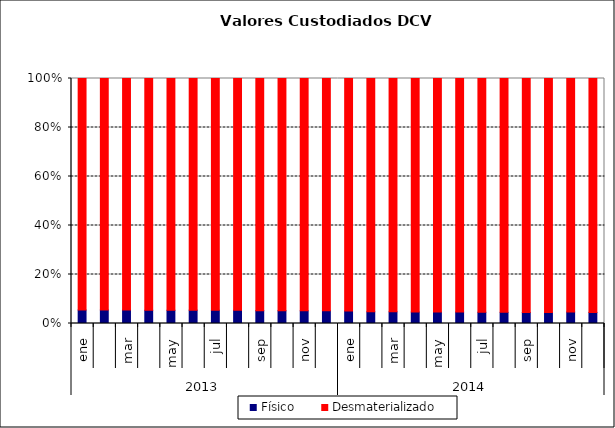
| Category | Físico | Desmaterializado |
|---|---|---|
| 0 | 17921.653 | 307082.68 |
| 1 | 17780.827 | 304347.313 |
| 2 | 17695.667 | 304854.166 |
| 3 | 17723.071 | 310584.153 |
| 4 | 16615.651 | 291164.134 |
| 5 | 16318.639 | 282792.334 |
| 6 | 15915.791 | 278455.193 |
| 7 | 16022.201 | 280146.291 |
| 8 | 15985.343 | 288455.62 |
| 9 | 15832.799 | 287224.805 |
| 10 | 14989.327 | 274347.685 |
| 11 | 15002.978 | 272880.592 |
| 12 | 14063.964 | 260638.354 |
| 13 | 13190.877 | 263956.944 |
| 14 | 13384.635 | 267835.215 |
| 15 | 13006.697 | 264721.528 |
| 16 | 13383.671 | 274245.968 |
| 17 | 13329.902 | 272643.72 |
| 18 | 12797.233 | 266526.797 |
| 19 | 12469.167 | 262034.791 |
| 20 | 12224.2 | 260483.18 |
| 21 | 12733.283 | 273303.267 |
| 22 | 13125.107 | 266757.246 |
| 23 | 12406.948 | 261608.521 |